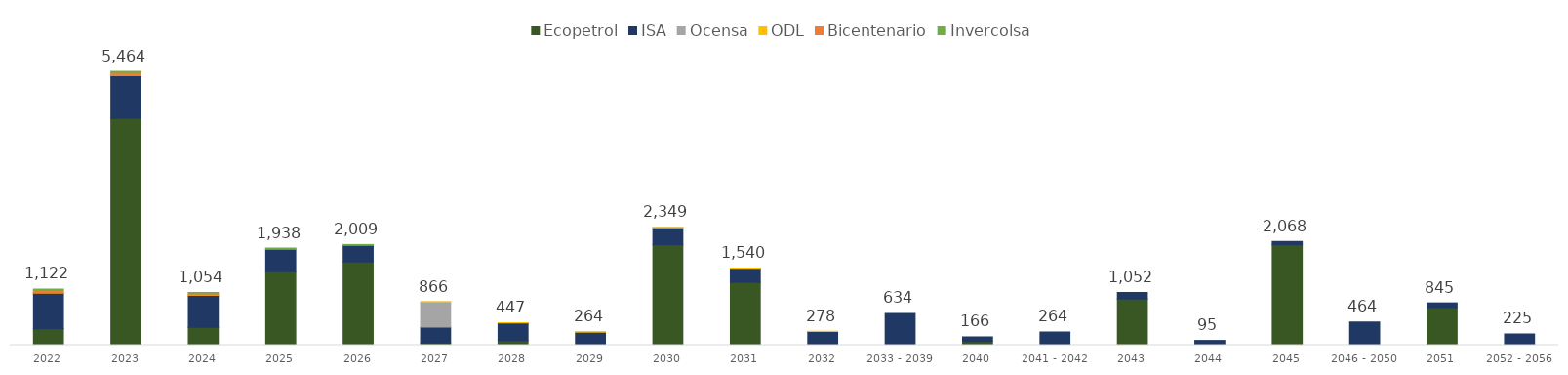
| Category | Ecopetrol | ISA | Ocensa | ODL | Bicentenario | Invercolsa |
|---|---|---|---|---|---|---|
| 2022 | 324.533 | 716.345 | 0 | 3.186 | 56.543 | 21.255 |
| 2023 | 4521.941 | 858.702 | 0 | 3.41 | 59.281 | 20.207 |
| 2024 | 353.823 | 639.227 | 0 | 3.649 | 38.699 | 18.69 |
| 2025 | 1467.229 | 452.744 | 0 | 3.904 | 0 | 13.923 |
| 2026 | 1660.47 | 336.198 | 0 | 4.178 | 0 | 8.188 |
| 2027 | 45.849 | 315.502 | 500 | 4.471 | 0 | 0 |
| 2028 | 90.62 | 351.94 | 0 | 4.784 | 0 | 0 |
| 2029 | 0 | 258.8 | 0 | 5.12 | 0 | 0 |
| 2030 | 2000 | 343.883 | 0 | 5.479 | 0 | 0 |
| 2031 | 1250 | 284.352 | 0 | 5.863 | 0 | 0 |
| 2032 | 0 | 272.445 | 0 | 5.734 | 0 | 0 |
| 2033 - 2039 | 0 | 633.727 | 0 | 0 | 0 | 0 |
| 2040 | 74.139 | 91.839 | 0 | 0 | 0 | 0 |
| 2041 - 2042 | 0 | 264.265 | 0 | 0 | 0 | 0 |
| 2043 | 918.572 | 133.184 | 0 | 0 | 0 | 0 |
| 2044 | 0 | 95.378 | 0 | 0 | 0 | 0 |
| 2045 | 2000 | 68.447 | 0 | 0 | 0 | 0 |
| 2046 - 2050 | 0 | 463.937 | 0 | 0 | 0 | 0 |
| 2051 | 750 | 94.883 | 0 | 0 | 0 | 0 |
| 2052 - 2056 | 0 | 225.207 | 0 | 0 | 0 | 0 |